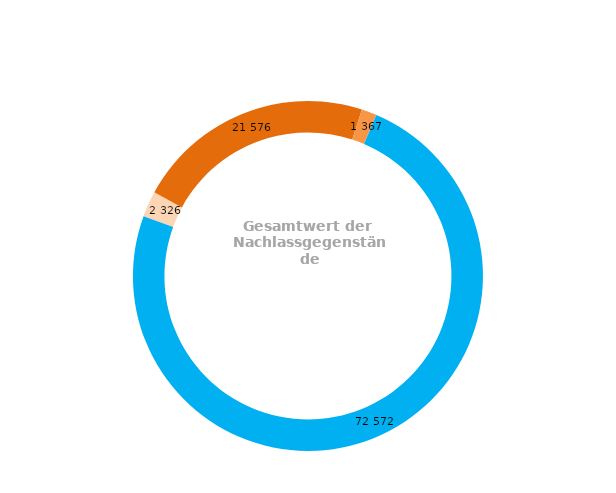
| Category | Series 0 |
|---|---|
| 0 | 2326 |
| 1 | 21576 |
| 2 | 1367 |
| 3 | 72572 |